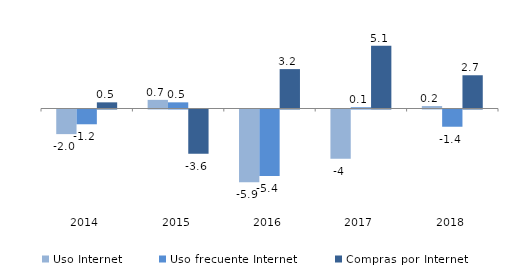
| Category | Uso Internet | Uso frecuente Internet | Compras por Internet |
|---|---|---|---|
| 2014.0 | -2 | -1.2 | 0.5 |
| 2015.0 | 0.7 | 0.5 | -3.6 |
| 2016.0 | -5.9 | -5.4 | 3.2 |
| 2017.0 | -4 | 0.1 | 5.1 |
| 2018.0 | 0.2 | -1.4 | 2.7 |